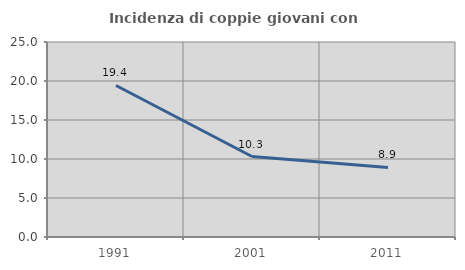
| Category | Incidenza di coppie giovani con figli |
|---|---|
| 1991.0 | 19.424 |
| 2001.0 | 10.319 |
| 2011.0 | 8.925 |